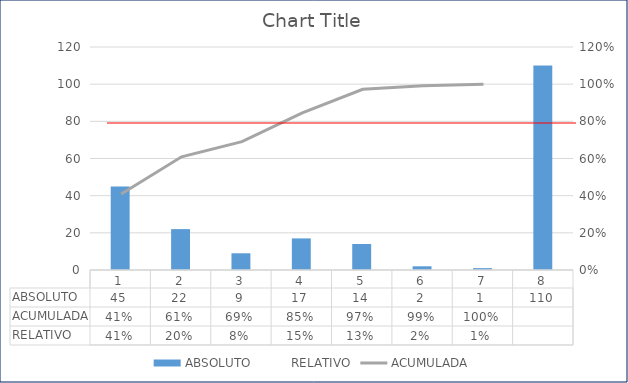
| Category | ABSOLUTO |
|---|---|
| 0 | 45 |
| 1 | 22 |
| 2 | 9 |
| 3 | 17 |
| 4 | 14 |
| 5 | 2 |
| 6 | 1 |
| 7 | 110 |